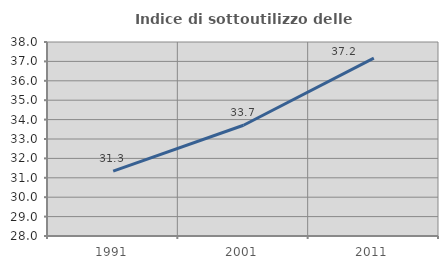
| Category | Indice di sottoutilizzo delle abitazioni  |
|---|---|
| 1991.0 | 31.345 |
| 2001.0 | 33.708 |
| 2011.0 | 37.165 |